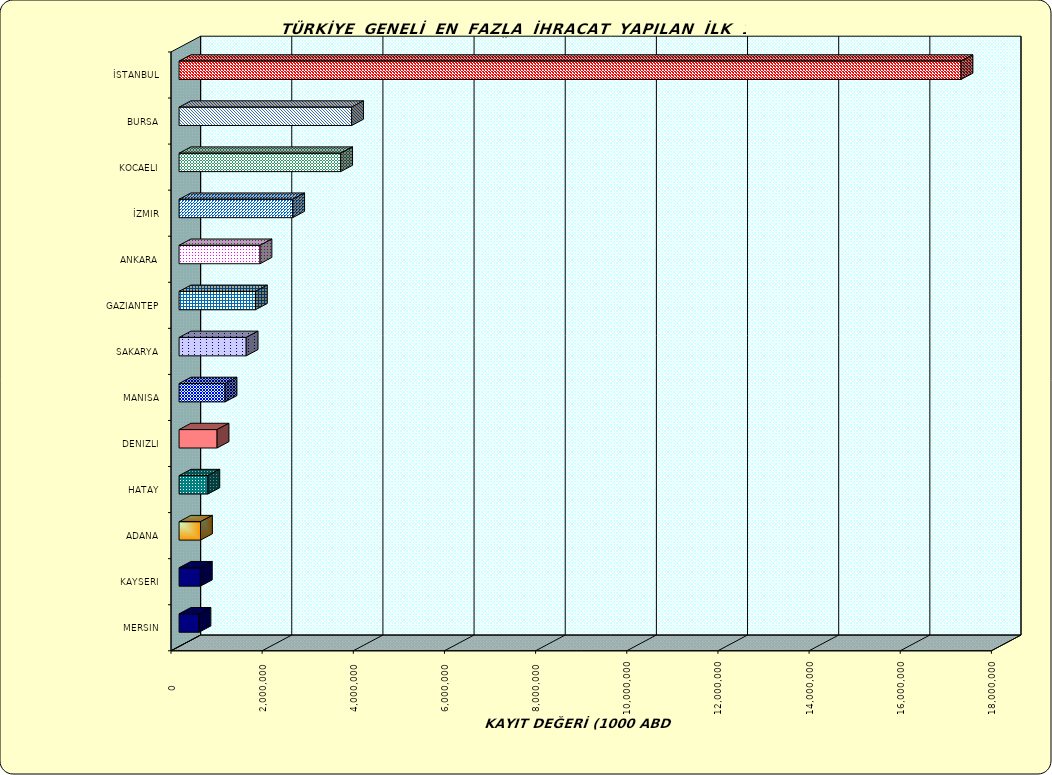
| Category | Series 0 |
|---|---|
| İSTANBUL | 17156671.548 |
| BURSA | 3785261.88 |
| KOCAELI | 3545961.098 |
| İZMIR | 2493293.762 |
| ANKARA | 1776102.713 |
| GAZIANTEP | 1675675.947 |
| SAKARYA | 1472725.706 |
| MANISA | 1009589.076 |
| DENIZLI | 834287.887 |
| HATAY | 632178.219 |
| ADANA | 470875.33 |
| KAYSERI | 467548.264 |
| MERSIN | 437471.839 |